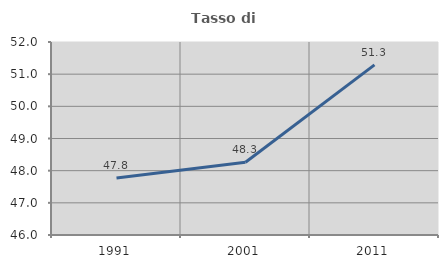
| Category | Tasso di occupazione   |
|---|---|
| 1991.0 | 47.769 |
| 2001.0 | 48.263 |
| 2011.0 | 51.289 |